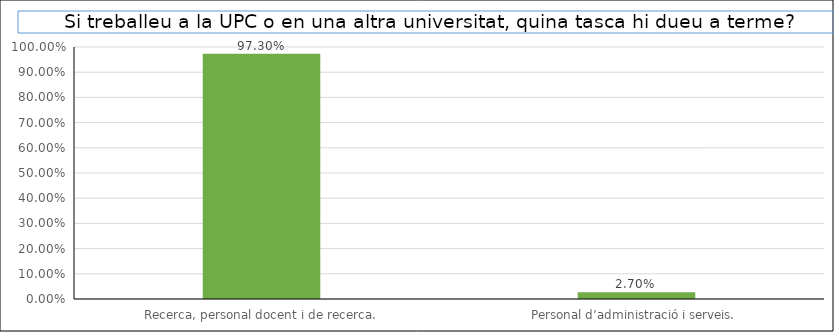
| Category | Series 0 |
|---|---|
| Recerca, personal docent i de recerca. | 0.973 |
| Personal d’administració i serveis. | 0.027 |